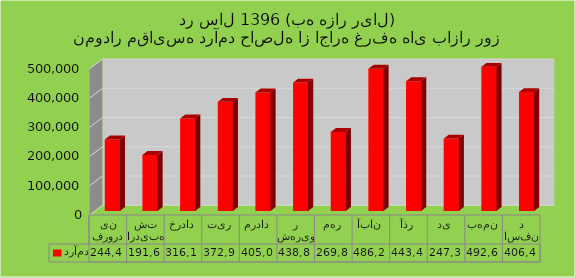
| Category | درآمد |
|---|---|
| فروردین | 244468 |
| اردیبهشت | 191681 |
| خرداد | 316125 |
| تیر | 372999 |
| مرداد | 405005 |
| شهریور | 438869 |
| مهر | 269832 |
| آبان | 486222 |
| آذر | 443478 |
| دی | 247340 |
| بهمن | 492699 |
| اسفند | 406457 |